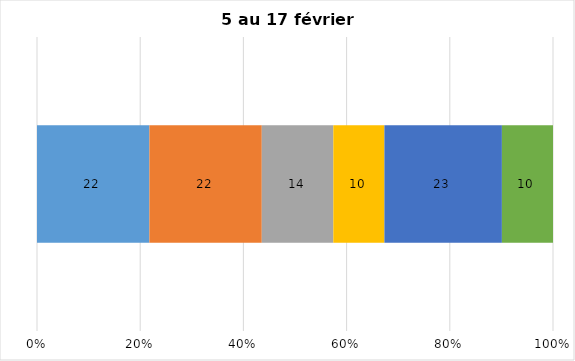
| Category | Plusieurs fois par jour | Une fois par jour | Quelques fois par semaine   | Une fois par semaine ou moins   |  Jamais   |  Je n’utilise pas les médias sociaux |
|---|---|---|---|---|---|---|
| 0 | 22 | 22 | 14 | 10 | 23 | 10 |